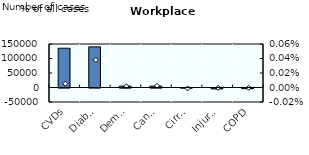
| Category | Number of cases |
|---|---|
| CVDs | 135515.827 |
| Diabetes | 140125.009 |
| Dementia | 4882.653 |
| Cancers | 4801.675 |
| Cirrhosis | -561.122 |
| Injuries | -2802.859 |
| COPD | -2156.11 |